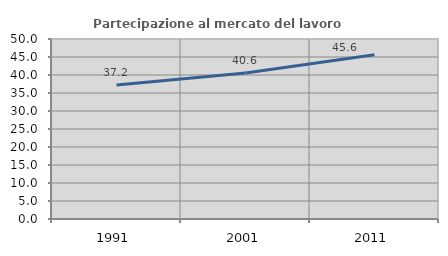
| Category | Partecipazione al mercato del lavoro  femminile |
|---|---|
| 1991.0 | 37.227 |
| 2001.0 | 40.576 |
| 2011.0 | 45.646 |